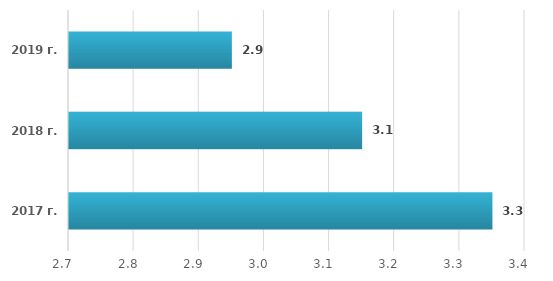
| Category | Series 0 |
|---|---|
| 2017 г. | 3.3 |
| 2018 г. | 3.1 |
| 2019 г. | 2.9 |